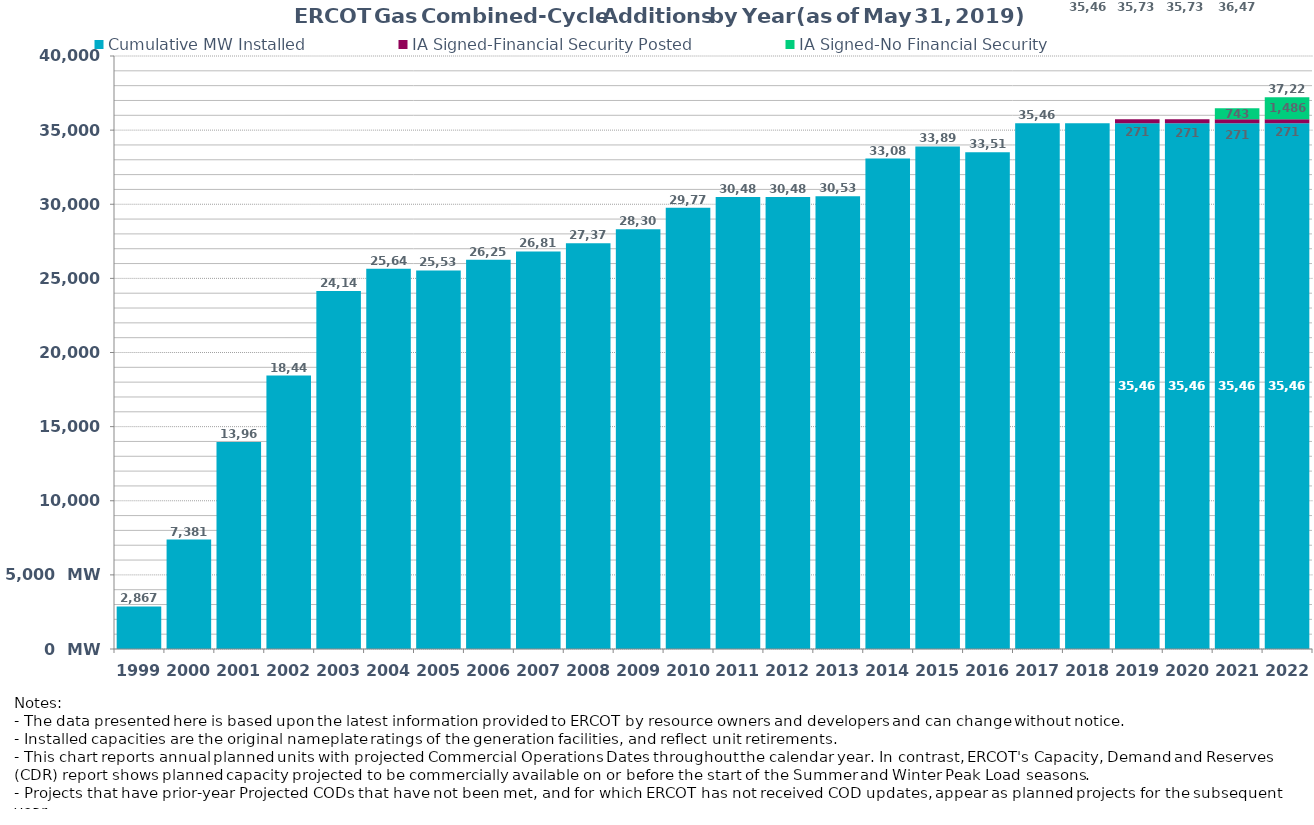
| Category | Cumulative MW Installed | IA Signed-Financial Security Posted  | IA Signed-No Financial Security  | Cumulative Installed and Planned |
|---|---|---|---|---|
| 1999.0 | 2867 | 0 | 0 | 2867 |
| 2000.0 | 7381 | 0 | 0 | 7381 |
| 2001.0 | 13967 | 0 | 0 | 13967 |
| 2002.0 | 18443 | 0 | 0 | 18443 |
| 2003.0 | 24141 | 0 | 0 | 24141 |
| 2004.0 | 25641 | 0 | 0 | 25641 |
| 2005.0 | 25539 | 0 | 0 | 25539 |
| 2006.0 | 26258 | 0 | 0 | 26258 |
| 2007.0 | 26815 | 0 | 0 | 26815 |
| 2008.0 | 27376 | 0 | 0 | 27376 |
| 2009.0 | 28309 | 0 | 0 | 28309 |
| 2010.0 | 29770 | 0 | 0 | 29770 |
| 2011.0 | 30488 | 0 | 0 | 30488 |
| 2012.0 | 30488 | 0 | 0 | 30488 |
| 2013.0 | 30538 | 0 | 0 | 30538 |
| 2014.0 | 33080 | 0 | 0 | 33080 |
| 2015.0 | 33897 | 0 | 0 | 33897 |
| 2016.0 | 33515 | 0 | 0 | 33515 |
| 2017.0 | 35465 | 0 | 0 | 35465 |
| 2018.0 | 35465 | 0 | 0 | 35465 |
| 2019.0 | 35465 | 271 | 0 | 35736 |
| 2020.0 | 35465 | 271 | 0 | 35736 |
| 2021.0 | 35465 | 271 | 742.9 | 36478.9 |
| 2022.0 | 35465 | 271 | 1485.8 | 37221.8 |